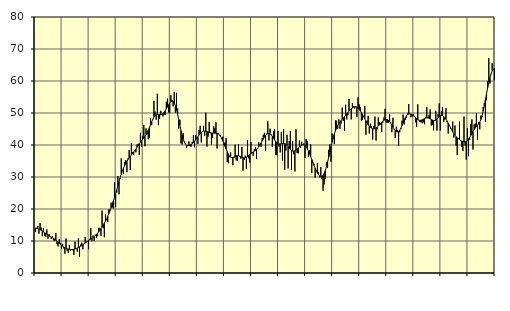
| Category | Piggar | Series 1 |
|---|---|---|
| nan | 12.8 | 14.09 |
| 87.0 | 14.1 | 13.96 |
| 87.0 | 14.7 | 13.85 |
| 87.0 | 12.3 | 13.72 |
| 87.0 | 15.6 | 13.55 |
| 87.0 | 14.2 | 13.36 |
| 87.0 | 11.5 | 13.14 |
| 87.0 | 14 | 12.9 |
| 87.0 | 11.7 | 12.62 |
| 87.0 | 11.4 | 12.34 |
| 87.0 | 13.6 | 12.08 |
| 87.0 | 10.7 | 11.83 |
| nan | 12.2 | 11.6 |
| 88.0 | 11.5 | 11.4 |
| 88.0 | 10.6 | 11.2 |
| 88.0 | 11.5 | 11.01 |
| 88.0 | 10.2 | 10.79 |
| 88.0 | 10.1 | 10.53 |
| 88.0 | 12.5 | 10.24 |
| 88.0 | 9.1 | 9.94 |
| 88.0 | 8.3 | 9.61 |
| 88.0 | 10.6 | 9.29 |
| 88.0 | 9.4 | 8.97 |
| 88.0 | 7.5 | 8.67 |
| nan | 9.1 | 8.4 |
| 89.0 | 7.7 | 8.14 |
| 89.0 | 6 | 7.92 |
| 89.0 | 10.8 | 7.73 |
| 89.0 | 7 | 7.57 |
| 89.0 | 6.3 | 7.46 |
| 89.0 | 8.7 | 7.39 |
| 89.0 | 7 | 7.34 |
| 89.0 | 7.2 | 7.34 |
| 89.0 | 7.1 | 7.37 |
| 89.0 | 5.7 | 7.42 |
| 89.0 | 9.8 | 7.5 |
| nan | 7.5 | 7.63 |
| 90.0 | 6.7 | 7.79 |
| 90.0 | 10.8 | 7.98 |
| 90.0 | 5.1 | 8.17 |
| 90.0 | 8.9 | 8.36 |
| 90.0 | 9.5 | 8.58 |
| 90.0 | 7.4 | 8.82 |
| 90.0 | 9.1 | 9.07 |
| 90.0 | 11.2 | 9.36 |
| 90.0 | 9.5 | 9.65 |
| 90.0 | 9.9 | 9.92 |
| 90.0 | 7.4 | 10.18 |
| nan | 10.7 | 10.4 |
| 91.0 | 14 | 10.59 |
| 91.0 | 9.9 | 10.8 |
| 91.0 | 11.7 | 11.05 |
| 91.0 | 10 | 11.34 |
| 91.0 | 12 | 11.68 |
| 91.0 | 11 | 12.05 |
| 91.0 | 11.5 | 12.46 |
| 91.0 | 14.1 | 12.88 |
| 91.0 | 14.1 | 13.32 |
| 91.0 | 11.6 | 13.82 |
| 91.0 | 19.5 | 14.35 |
| nan | 14 | 14.93 |
| 92.0 | 11.2 | 15.56 |
| 92.0 | 18.3 | 16.21 |
| 92.0 | 16.5 | 16.93 |
| 92.0 | 16 | 17.73 |
| 92.0 | 19.9 | 18.58 |
| 92.0 | 19.7 | 19.47 |
| 92.0 | 22 | 20.42 |
| 92.0 | 20.5 | 21.43 |
| 92.0 | 20.2 | 22.49 |
| 92.0 | 28.3 | 23.62 |
| 92.0 | 20.6 | 24.8 |
| nan | 25.2 | 26.01 |
| 93.0 | 30.3 | 27.27 |
| 93.0 | 24.6 | 28.53 |
| 93.0 | 29.4 | 29.73 |
| 93.0 | 35.8 | 30.85 |
| 93.0 | 31.9 | 31.88 |
| 93.0 | 31 | 32.79 |
| 93.0 | 34.7 | 33.58 |
| 93.0 | 35.3 | 34.27 |
| 93.0 | 31.5 | 34.88 |
| 93.0 | 35.8 | 35.43 |
| 93.0 | 38.4 | 35.93 |
| nan | 32.2 | 36.43 |
| 94.0 | 40.6 | 36.89 |
| 94.0 | 37.8 | 37.34 |
| 94.0 | 36.9 | 37.81 |
| 94.0 | 38.1 | 38.27 |
| 94.0 | 37.7 | 38.74 |
| 94.0 | 40.1 | 39.26 |
| 94.0 | 40.4 | 39.8 |
| 94.0 | 36.9 | 40.35 |
| 94.0 | 43.8 | 40.88 |
| 94.0 | 39.5 | 41.36 |
| 94.0 | 42.8 | 41.8 |
| nan | 46.2 | 42.22 |
| 95.0 | 39.6 | 42.67 |
| 95.0 | 45.2 | 43.19 |
| 95.0 | 43.4 | 43.83 |
| 95.0 | 41.8 | 44.6 |
| 95.0 | 42.3 | 45.45 |
| 95.0 | 48.4 | 46.34 |
| 95.0 | 46.2 | 47.22 |
| 95.0 | 47.9 | 48.04 |
| 95.0 | 53.8 | 48.71 |
| 95.0 | 50.4 | 49.17 |
| 95.0 | 47.9 | 49.43 |
| nan | 56 | 49.54 |
| 96.0 | 46.2 | 49.52 |
| 96.0 | 48.2 | 49.48 |
| 96.0 | 50.7 | 49.48 |
| 96.0 | 49.6 | 49.58 |
| 96.0 | 48.9 | 49.84 |
| 96.0 | 49.5 | 50.24 |
| 96.0 | 49.4 | 50.74 |
| 96.0 | 53.5 | 51.33 |
| 96.0 | 54.5 | 51.95 |
| 96.0 | 50.2 | 52.56 |
| 96.0 | 49.9 | 53.13 |
| nan | 55.5 | 53.56 |
| 97.0 | 54.1 | 53.75 |
| 97.0 | 52.1 | 53.63 |
| 97.0 | 56.6 | 53.15 |
| 97.0 | 50.1 | 52.29 |
| 97.0 | 56.3 | 51.09 |
| 97.0 | 51.4 | 49.6 |
| 97.0 | 45.1 | 47.95 |
| 97.0 | 47.9 | 46.22 |
| 97.0 | 40.5 | 44.53 |
| 97.0 | 40.2 | 43.03 |
| 97.0 | 43.7 | 41.8 |
| nan | 41 | 40.88 |
| 98.0 | 40.6 | 40.27 |
| 98.0 | 39.1 | 39.93 |
| 98.0 | 39.7 | 39.81 |
| 98.0 | 41.1 | 39.84 |
| 98.0 | 39.6 | 39.98 |
| 98.0 | 39.5 | 40.18 |
| 98.0 | 41 | 40.46 |
| 98.0 | 43.1 | 40.78 |
| 98.0 | 39.3 | 41.17 |
| 98.0 | 43.1 | 41.64 |
| 98.0 | 42.3 | 42.15 |
| nan | 40.3 | 42.64 |
| 99.0 | 44.7 | 43.12 |
| 99.0 | 46 | 43.58 |
| 99.0 | 40.8 | 43.96 |
| 99.0 | 44.3 | 44.22 |
| 99.0 | 46 | 44.33 |
| 99.0 | 42.9 | 44.35 |
| 99.0 | 50.1 | 44.29 |
| 99.0 | 39.5 | 44.18 |
| 99.0 | 42.6 | 44.06 |
| 99.0 | 47.2 | 43.94 |
| 99.0 | 43.7 | 43.84 |
| nan | 40.2 | 43.78 |
| 0.0 | 42.3 | 43.76 |
| 0.0 | 45.8 | 43.72 |
| 0.0 | 45.2 | 43.7 |
| 0.0 | 47.1 | 43.69 |
| 0.0 | 38.9 | 43.62 |
| 0.0 | 43.8 | 43.46 |
| 0.0 | 43.2 | 43.15 |
| 0.0 | 43.1 | 42.69 |
| 0.0 | 41.9 | 42.1 |
| 0.0 | 42.6 | 41.36 |
| 0.0 | 40 | 40.5 |
| nan | 40.8 | 39.61 |
| 1.0 | 42.1 | 38.73 |
| 1.0 | 34.7 | 37.89 |
| 1.0 | 34.3 | 37.16 |
| 1.0 | 36.2 | 36.57 |
| 1.0 | 37.7 | 36.19 |
| 1.0 | 36.1 | 36.06 |
| 1.0 | 33.7 | 36.1 |
| 1.0 | 36 | 36.27 |
| 1.0 | 40.1 | 36.47 |
| 1.0 | 35.2 | 36.63 |
| 1.0 | 35 | 36.71 |
| nan | 40.2 | 36.67 |
| 2.0 | 36.3 | 36.53 |
| 2.0 | 35.7 | 36.33 |
| 2.0 | 39.4 | 36.16 |
| 2.0 | 32 | 36.03 |
| 2.0 | 35.3 | 35.98 |
| 2.0 | 36.7 | 36.04 |
| 2.0 | 32.6 | 36.2 |
| 2.0 | 41.5 | 36.45 |
| 2.0 | 35.8 | 36.74 |
| 2.0 | 34.5 | 37.04 |
| 2.0 | 40.9 | 37.33 |
| nan | 37.7 | 37.58 |
| 3.0 | 36.6 | 37.81 |
| 3.0 | 38.7 | 38.06 |
| 3.0 | 39.3 | 38.32 |
| 3.0 | 35.6 | 38.64 |
| 3.0 | 38.7 | 39.04 |
| 3.0 | 40.8 | 39.5 |
| 3.0 | 40.1 | 40.06 |
| 3.0 | 39.4 | 40.66 |
| 3.0 | 42.1 | 41.27 |
| 3.0 | 43.2 | 41.88 |
| 3.0 | 43.8 | 42.47 |
| nan | 38.1 | 42.97 |
| 4.0 | 43.6 | 43.33 |
| 4.0 | 47.4 | 43.55 |
| 4.0 | 41.4 | 43.57 |
| 4.0 | 45.1 | 43.44 |
| 4.0 | 43.3 | 43.14 |
| 4.0 | 39.4 | 42.69 |
| 4.0 | 44.4 | 42.15 |
| 4.0 | 44.9 | 41.58 |
| 4.0 | 36.9 | 41.09 |
| 4.0 | 36.8 | 40.71 |
| 4.0 | 44.4 | 40.44 |
| nan | 39.5 | 40.33 |
| 5.0 | 37.7 | 40.34 |
| 5.0 | 44.1 | 40.4 |
| 5.0 | 35.2 | 40.49 |
| 5.0 | 45 | 40.53 |
| 5.0 | 32.3 | 40.46 |
| 5.0 | 38.3 | 40.26 |
| 5.0 | 43.2 | 39.94 |
| 5.0 | 32.7 | 39.51 |
| 5.0 | 41.2 | 39.05 |
| 5.0 | 44.3 | 38.64 |
| 5.0 | 32.2 | 38.32 |
| nan | 41.2 | 38.12 |
| 6.0 | 37.1 | 38.09 |
| 6.0 | 31.7 | 38.2 |
| 6.0 | 44.9 | 38.42 |
| 6.0 | 37.5 | 38.74 |
| 6.0 | 37.4 | 39.07 |
| 6.0 | 41.4 | 39.4 |
| 6.0 | 39.1 | 39.71 |
| 6.0 | 41 | 39.96 |
| 6.0 | 40.1 | 40.11 |
| 6.0 | 40.5 | 40.09 |
| 6.0 | 36 | 39.88 |
| nan | 41.9 | 39.48 |
| 7.0 | 41.2 | 38.89 |
| 7.0 | 36.3 | 38.15 |
| 7.0 | 38.3 | 37.3 |
| 7.0 | 40.2 | 36.37 |
| 7.0 | 31.3 | 35.45 |
| 7.0 | 34.4 | 34.55 |
| 7.0 | 34.1 | 33.65 |
| 7.0 | 29.8 | 32.79 |
| 7.0 | 32.1 | 31.98 |
| 7.0 | 34.3 | 31.26 |
| 7.0 | 31.5 | 30.69 |
| nan | 29.8 | 30.31 |
| 8.0 | 33.1 | 30.12 |
| 8.0 | 29.3 | 30.19 |
| 8.0 | 25.7 | 30.53 |
| 8.0 | 27.7 | 31.14 |
| 8.0 | 29.4 | 32.03 |
| 8.0 | 34.6 | 33.21 |
| 8.0 | 32.9 | 34.62 |
| 8.0 | 38.5 | 36.19 |
| 8.0 | 40.2 | 37.82 |
| 8.0 | 34.8 | 39.4 |
| 8.0 | 43.6 | 40.89 |
| nan | 42 | 42.24 |
| 9.0 | 40.3 | 43.42 |
| 9.0 | 47.7 | 44.44 |
| 9.0 | 47.6 | 45.32 |
| 9.0 | 45.1 | 46.06 |
| 9.0 | 48 | 46.69 |
| 9.0 | 45.1 | 47.21 |
| 9.0 | 46.7 | 47.65 |
| 9.0 | 51.7 | 48.06 |
| 9.0 | 47.5 | 48.44 |
| 9.0 | 44.4 | 48.86 |
| 9.0 | 52.6 | 49.31 |
| nan | 48 | 49.75 |
| 10.0 | 49.3 | 50.17 |
| 10.0 | 54.4 | 50.59 |
| 10.0 | 51.1 | 50.97 |
| 10.0 | 48 | 51.33 |
| 10.0 | 53.1 | 51.61 |
| 10.0 | 52.1 | 51.81 |
| 10.0 | 51.4 | 51.91 |
| 10.0 | 52.1 | 51.89 |
| 10.0 | 48.8 | 51.74 |
| 10.0 | 54.9 | 51.49 |
| 10.0 | 52.7 | 51.13 |
| nan | 51.8 | 50.67 |
| 11.0 | 47.6 | 50.13 |
| 11.0 | 47.8 | 49.51 |
| 11.0 | 48.9 | 48.83 |
| 11.0 | 52.2 | 48.16 |
| 11.0 | 43.2 | 47.52 |
| 11.0 | 47.6 | 46.89 |
| 11.0 | 49.1 | 46.33 |
| 11.0 | 43.6 | 45.88 |
| 11.0 | 46.7 | 45.54 |
| 11.0 | 45.8 | 45.3 |
| 11.0 | 41.7 | 45.13 |
| nan | 45.9 | 45.06 |
| 12.0 | 48.9 | 45.11 |
| 12.0 | 41.4 | 45.29 |
| 12.0 | 44.9 | 45.57 |
| 12.0 | 48.6 | 45.91 |
| 12.0 | 47.2 | 46.3 |
| 12.0 | 46.4 | 46.71 |
| 12.0 | 44.1 | 47.1 |
| 12.0 | 47 | 47.45 |
| 12.0 | 48.6 | 47.73 |
| 12.0 | 51.3 | 47.9 |
| 12.0 | 47 | 47.98 |
| nan | 47 | 47.93 |
| 13.0 | 46.9 | 47.73 |
| 13.0 | 49.6 | 47.37 |
| 13.0 | 47.1 | 46.85 |
| 13.0 | 44 | 46.22 |
| 13.0 | 48.5 | 45.55 |
| 13.0 | 45 | 44.93 |
| 13.0 | 42.2 | 44.46 |
| 13.0 | 45.7 | 44.17 |
| 13.0 | 44.7 | 44.09 |
| 13.0 | 39.7 | 44.24 |
| 13.0 | 44 | 44.64 |
| nan | 45 | 45.26 |
| 14.0 | 47.6 | 46.04 |
| 14.0 | 49.5 | 46.9 |
| 14.0 | 46.4 | 47.76 |
| 14.0 | 47.8 | 48.52 |
| 14.0 | 48.5 | 49.12 |
| 14.0 | 49.9 | 49.5 |
| 14.0 | 52.8 | 49.7 |
| 14.0 | 49.7 | 49.72 |
| 14.0 | 48.7 | 49.61 |
| 14.0 | 48.9 | 49.43 |
| 14.0 | 49.6 | 49.19 |
| nan | 49 | 48.9 |
| 15.0 | 47.1 | 48.57 |
| 15.0 | 45.7 | 48.24 |
| 15.0 | 52.7 | 47.95 |
| 15.0 | 47.8 | 47.75 |
| 15.0 | 47.2 | 47.68 |
| 15.0 | 47.1 | 47.74 |
| 15.0 | 46.8 | 47.88 |
| 15.0 | 47.1 | 48.06 |
| 15.0 | 46.5 | 48.25 |
| 15.0 | 48.8 | 48.41 |
| 15.0 | 51.8 | 48.48 |
| nan | 48.4 | 48.46 |
| 16.0 | 49.4 | 48.37 |
| 16.0 | 51.1 | 48.2 |
| 16.0 | 46.1 | 47.99 |
| 16.0 | 46.3 | 47.79 |
| 16.0 | 44.6 | 47.66 |
| 16.0 | 47.5 | 47.65 |
| 16.0 | 50.7 | 47.79 |
| 16.0 | 44.5 | 48.08 |
| 16.0 | 49.6 | 48.46 |
| 16.0 | 53 | 48.85 |
| 16.0 | 44.5 | 49.13 |
| nan | 50.5 | 49.25 |
| 17.0 | 51.9 | 49.18 |
| 17.0 | 47.2 | 48.93 |
| 17.0 | 47.9 | 48.55 |
| 17.0 | 51.5 | 48.08 |
| 17.0 | 47.2 | 47.52 |
| 17.0 | 43.6 | 46.87 |
| 17.0 | 46.2 | 46.17 |
| 17.0 | 45.1 | 45.48 |
| 17.0 | 44.8 | 44.78 |
| 17.0 | 47.3 | 44.1 |
| 17.0 | 42.3 | 43.5 |
| nan | 46.1 | 43 |
| 18.0 | 39.8 | 42.58 |
| 18.0 | 36.9 | 42.25 |
| 18.0 | 42.2 | 41.96 |
| 18.0 | 47.3 | 41.68 |
| 18.0 | 41.4 | 41.42 |
| 18.0 | 39.4 | 41.22 |
| 18.0 | 38.1 | 41.08 |
| 18.0 | 48.9 | 41 |
| 18.0 | 39.8 | 41.01 |
| 18.0 | 35.4 | 41.13 |
| 18.0 | 45.2 | 41.39 |
| nan | 36.5 | 41.8 |
| 19.0 | 41.6 | 42.33 |
| 19.0 | 46.6 | 42.96 |
| 19.0 | 48 | 43.62 |
| 19.0 | 38.6 | 44.25 |
| 19.0 | 46.4 | 44.83 |
| 19.0 | 46.7 | 45.35 |
| 19.0 | 49.9 | 45.78 |
| 19.0 | 41.6 | 46.16 |
| 19.0 | 47.2 | 46.56 |
| 19.0 | 44.9 | 47.13 |
| 19.0 | 49.2 | 47.96 |
| nan | 48.7 | 49.09 |
| 20.0 | 51.9 | 50.55 |
| 20.0 | 53.1 | 52.25 |
| 20.0 | 47.3 | 54.11 |
| 20.0 | 54 | 56.03 |
| 20.0 | 59.9 | 57.91 |
| 20.0 | 67.1 | 59.61 |
| 20.0 | 59.2 | 61.06 |
| 20.0 | 62.1 | 62.22 |
| 20.0 | 65.5 | 63.1 |
| 20.0 | 63.6 | 63.68 |
| 20.0 | 60.3 | 64 |